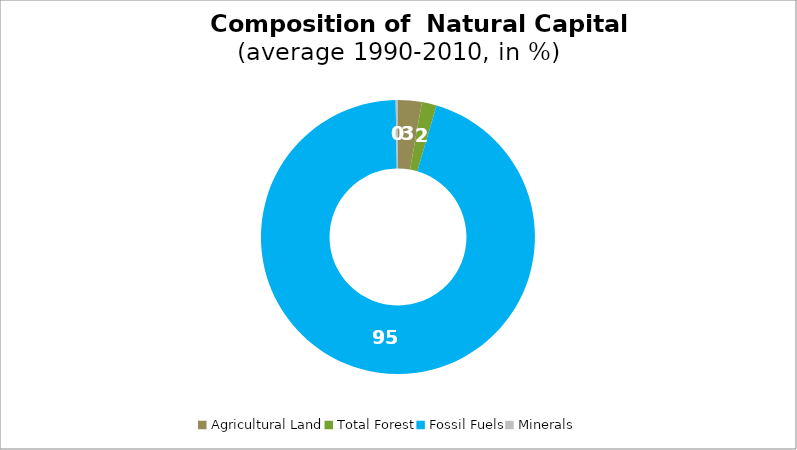
| Category | Series 0 |
|---|---|
| Agricultural Land | 2.801 |
| Total Forest | 1.742 |
| Fossil Fuels | 95.182 |
| Minerals | 0.275 |